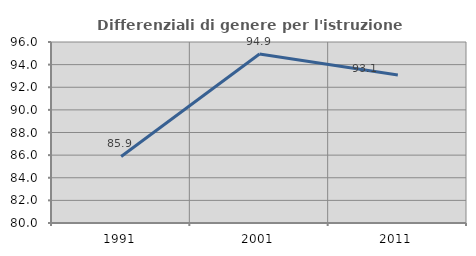
| Category | Differenziali di genere per l'istruzione superiore |
|---|---|
| 1991.0 | 85.88 |
| 2001.0 | 94.942 |
| 2011.0 | 93.075 |